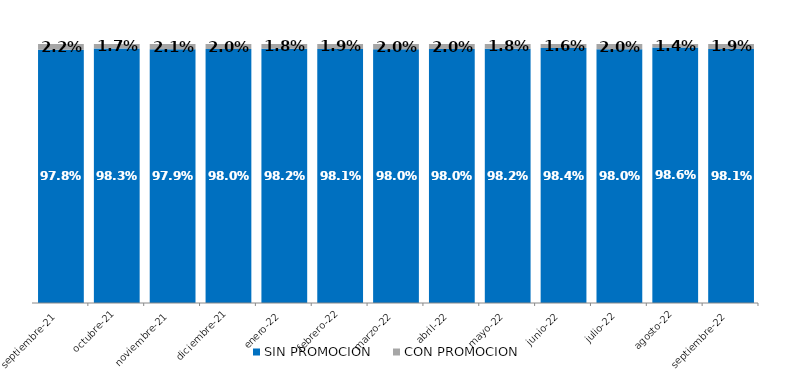
| Category | SIN PROMOCION   | CON PROMOCION   |
|---|---|---|
| 2021-09-01 | 0.978 | 0.022 |
| 2021-10-01 | 0.983 | 0.017 |
| 2021-11-01 | 0.979 | 0.021 |
| 2021-12-01 | 0.98 | 0.02 |
| 2022-01-01 | 0.982 | 0.018 |
| 2022-02-01 | 0.981 | 0.019 |
| 2022-03-01 | 0.98 | 0.02 |
| 2022-04-01 | 0.98 | 0.02 |
| 2022-05-01 | 0.982 | 0.018 |
| 2022-06-01 | 0.984 | 0.016 |
| 2022-07-01 | 0.98 | 0.02 |
| 2022-08-01 | 0.986 | 0.014 |
| 2022-09-01 | 0.981 | 0.019 |